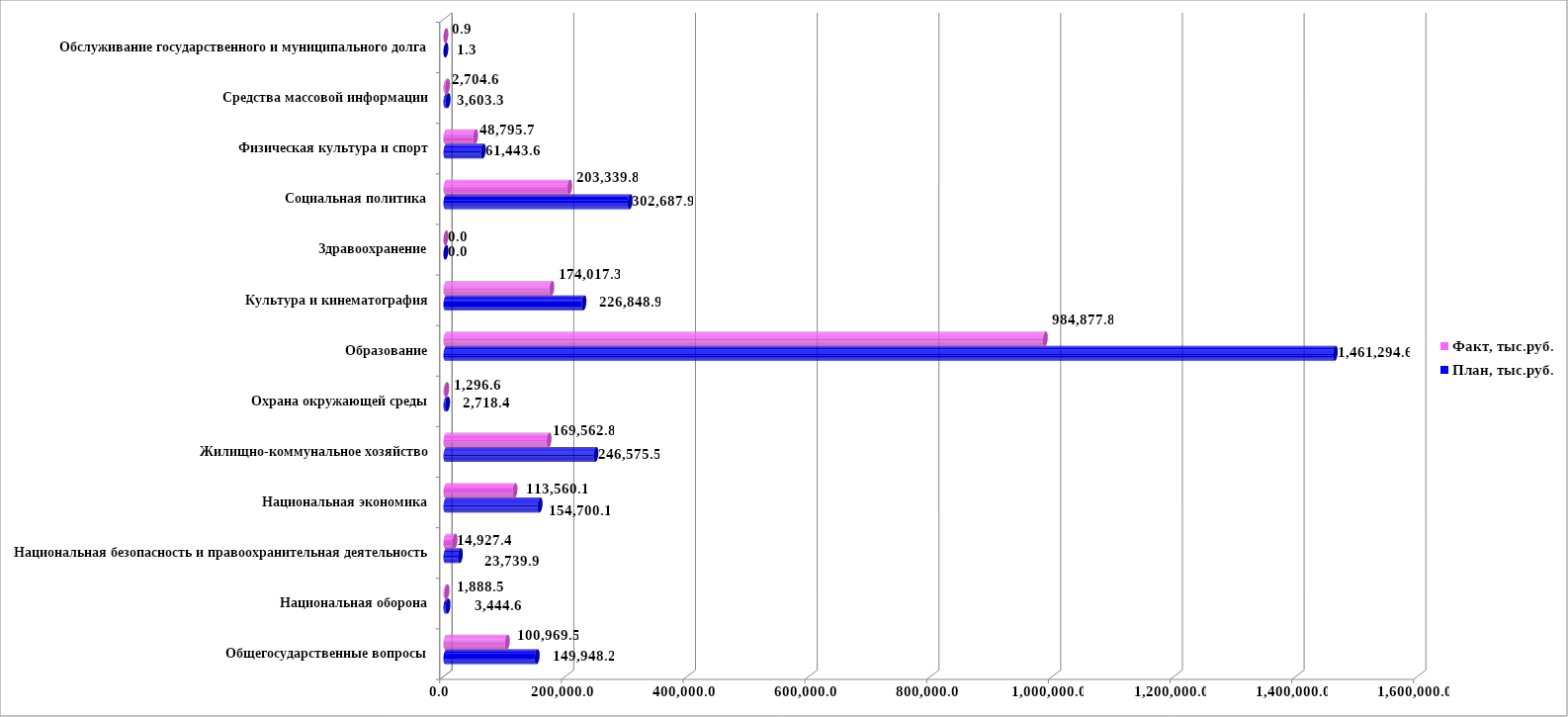
| Category | План, тыс.руб. | Факт, тыс.руб. |
|---|---|---|
| Общегосударственные вопросы | 149948.223 | 100969.528 |
| Национальная оборона | 3444.6 | 1888.469 |
| Национальная безопасность и правоохранительная деятельность | 23739.943 | 14927.374 |
| Национальная экономика | 154700.08 | 113560.131 |
| Жилищно-коммунальное хозяйство | 246575.512 | 169562.798 |
| Охрана окружающей среды | 2718.392 | 1296.571 |
| Образование | 1461294.607 | 984877.84 |
| Культура и кинематография | 226848.916 | 174017.286 |
| Здравоохранение | 0 | 0 |
| Социальная политика | 302687.916 | 203339.828 |
| Физическая культура и спорт | 61443.57 | 48795.677 |
| Средства массовой информации | 3603.306 | 2704.556 |
| Обслуживание государственного и муниципального долга | 1.3 | 0.912 |